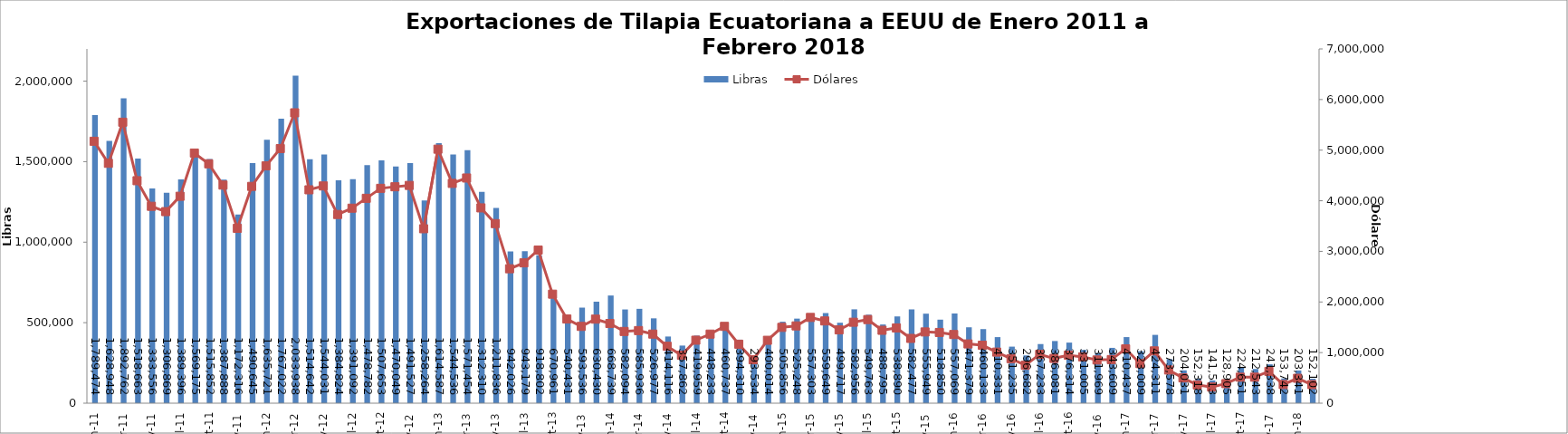
| Category | Libras  |
|---|---|
| 2011-01-01 | 1789473.82 |
| 2011-02-01 | 1628948.076 |
| 2011-03-01 | 1892761.535 |
| 2011-04-01 | 1518662.961 |
| 2011-05-01 | 1333555.926 |
| 2011-06-01 | 1306869.243 |
| 2011-07-01 | 1389396.24 |
| 2011-08-01 | 1569174.756 |
| 2011-09-01 | 1515852.096 |
| 2011-10-01 | 1387888.293 |
| 2011-11-01 | 1172315.891 |
| 2011-12-01 | 1490644.699 |
| 2012-01-01 | 1635720.607 |
| 2012-02-01 | 1767022.174 |
| 2012-03-01 | 2033937.505 |
| 2012-04-01 | 1514641.77 |
| 2012-05-01 | 1544031.293 |
| 2012-06-01 | 1384823.899 |
| 2012-07-01 | 1391091.577 |
| 2012-08-01 | 1478781.747 |
| 2012-09-01 | 1507653.188 |
| 2012-10-01 | 1470049.326 |
| 2012-11-01 | 1491526.539 |
| 2012-12-01 | 1258264 |
| 2013-01-01 | 1614587 |
| 2013-02-01 | 1544536.146 |
| 2013-03-01 | 1571454.312 |
| 2013-04-01 | 1312310.196 |
| 2013-05-01 | 1211835.551 |
| 2013-06-01 | 942025.58 |
| 2013-07-01 | 943178.586 |
| 2013-08-01 | 918802.324 |
| 2013-09-01 | 670961.192 |
| 2013-10-01 | 540431.235 |
| 2013-11-01 | 593535.64 |
| 2013-12-01 | 630429.621 |
| 2014-01-01 | 668739 |
| 2014-02-01 | 582093.766 |
| 2014-03-01 | 585936.383 |
| 2014-04-01 | 526976.561 |
| 2014-05-01 | 414116.473 |
| 2014-06-01 | 357861.695 |
| 2014-07-01 | 419958.663 |
| 2014-08-01 | 448233 |
| 2014-09-01 | 460737.149 |
| 2014-10-01 | 394310.347 |
| 2014-11-01 | 293533.672 |
| 2014-12-01 | 400013.647 |
| 2015-01-01 | 505856.493 |
| 2015-02-01 | 525248 |
| 2015-03-01 | 557303.039 |
| 2015-04-01 | 559648.733 |
| 2015-05-01 | 499716.682 |
| 2015-06-01 | 582955.764 |
| 2015-07-01 | 549763.307 |
| 2015-08-01 | 488795.094 |
| 2015-09-01 | 538890.219 |
| 2015-10-01 | 582477.366 |
| 2015-11-01 | 555949.414 |
| 2015-12-01 | 518850.405 |
| 2016-01-01 | 557069.351 |
| 2016-02-01 | 471378.754 |
| 2016-03-01 | 460133.089 |
| 2016-04-01 | 410331.175 |
| 2016-05-01 | 351235 |
| 2016-06-01 | 296682 |
| 2016-07-01 | 367233.45 |
| 2016-08-01 | 386080.575 |
| 2016-09-01 | 376314.197 |
| 2016-10-01 | 331005.258 |
| 2016-11-01 | 311968.537 |
| 2016-12-01 | 343608.956 |
| 2017-01-01 | 410436.996 |
| 2017-02-01 | 323009.174 |
| 2017-03-01 | 424310.544 |
| 2017-04-01 | 273577.632 |
| 2017-05-01 | 204031.321 |
| 2017-06-01 | 152318.019 |
| 2017-07-01 | 141513.274 |
| 2017-08-01 | 128905.167 |
| 2017-09-01 | 224650.945 |
| 2017-10-01 | 212543.281 |
| 2017-11-01 | 241337.562 |
| 2017-12-01 | 153742.19 |
| 2018-01-01 | 203341.281 |
| 2018-02-01 | 152101.968 |